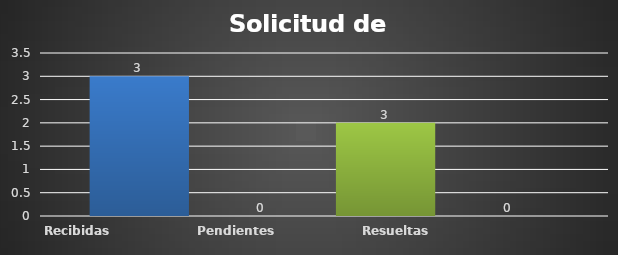
| Category | Recibidas  | Pendientes  | Resueltas | Rechazadas  |
|---|---|---|---|---|
| Recibidas  | 3 | 0 | 2 | 0 |